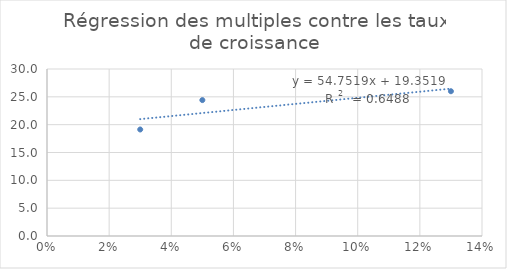
| Category | Series 0 |
|---|---|
| 0.03 | 19.134 |
| 0.05 | 24.415 |
| 0.13 | 26.004 |